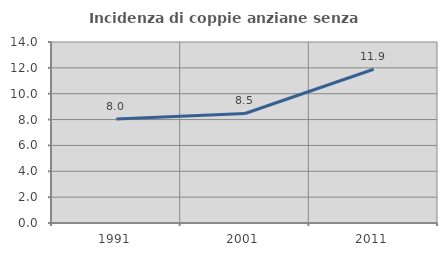
| Category | Incidenza di coppie anziane senza figli  |
|---|---|
| 1991.0 | 8.04 |
| 2001.0 | 8.471 |
| 2011.0 | 11.894 |